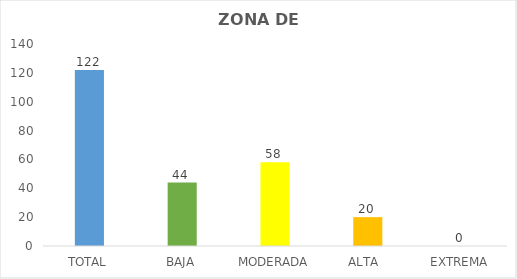
| Category | Series 0 |
|---|---|
| TOTAL | 122 |
| BAJA | 44 |
| MODERADA | 58 |
| ALTA  | 20 |
| EXTREMA | 0 |